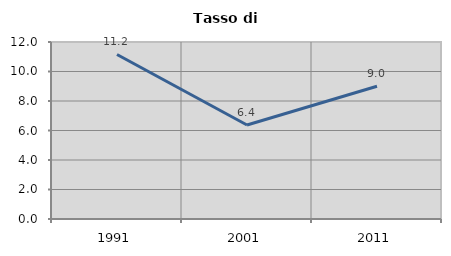
| Category | Tasso di disoccupazione   |
|---|---|
| 1991.0 | 11.154 |
| 2001.0 | 6.375 |
| 2011.0 | 8.996 |